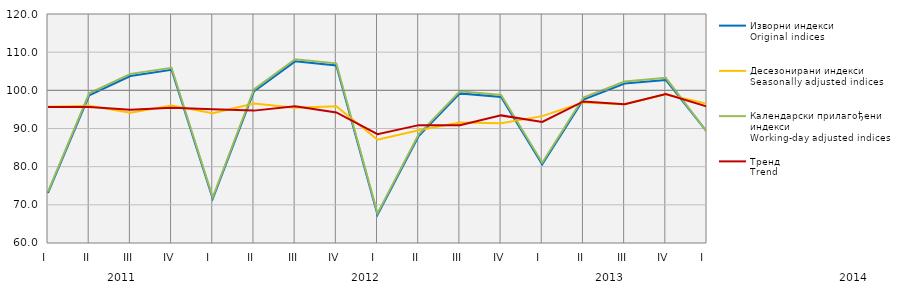
| Category | Изворни индекси
Original indices | Десезонирани индекси
Seasonally adjusted indices | Календарски прилагођени индекси
Working-day adjusted indices | Тренд
Trend |
|---|---|---|---|---|
| I  | 73.105 | 95.725 | 73.486 | 95.609 |
| II | 98.686 | 95.974 | 99.209 | 95.603 |
| III | 103.754 | 94.145 | 104.311 | 94.933 |
| IV | 105.376 | 96.039 | 105.917 | 95.407 |
| I  | 71.601 | 93.981 | 71.98 | 95.034 |
| II | 99.705 | 96.547 | 100.233 | 94.685 |
| III | 107.6 | 95.442 | 108.153 | 95.841 |
| IV | 106.508 | 95.808 | 107.079 | 94.22 |
| I  | 67.411 | 87.053 | 67.763 | 88.497 |
| II | 88.026 | 89.522 | 88.493 | 90.882 |
| III | 99.2 | 91.587 | 99.732 | 90.852 |
| IV | 98.255 | 91.384 | 98.783 | 93.436 |
| I  | 80.624 | 93.242 | 81.045 | 91.713 |
| II | 97.612 | 96.832 | 98.129 | 97.082 |
| III | 101.777 | 96.385 | 102.323 | 96.339 |
| IV | 102.721 | 98.98 | 103.272 | 99.004 |
| I  | 89.092 | 96.476 | 89.087 | 95.754 |